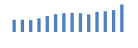
| Category | Exportações (1) |
|---|---|
| 0 | 203692.629 |
| 1 | 204985.899 |
| 2 | 199789.293 |
| 3 | 228223.553 |
| 4 | 265930.688 |
| 5 | 297441.741 |
| 6 | 313195.508 |
| 7 | 319331.634 |
| 8 | 313646.514 |
| 9 | 292708.824 |
| 10 | 335676.548 |
| 11 | 346139.442 |
| 12 | 364472.386 |
| 13 | 458387.563 |